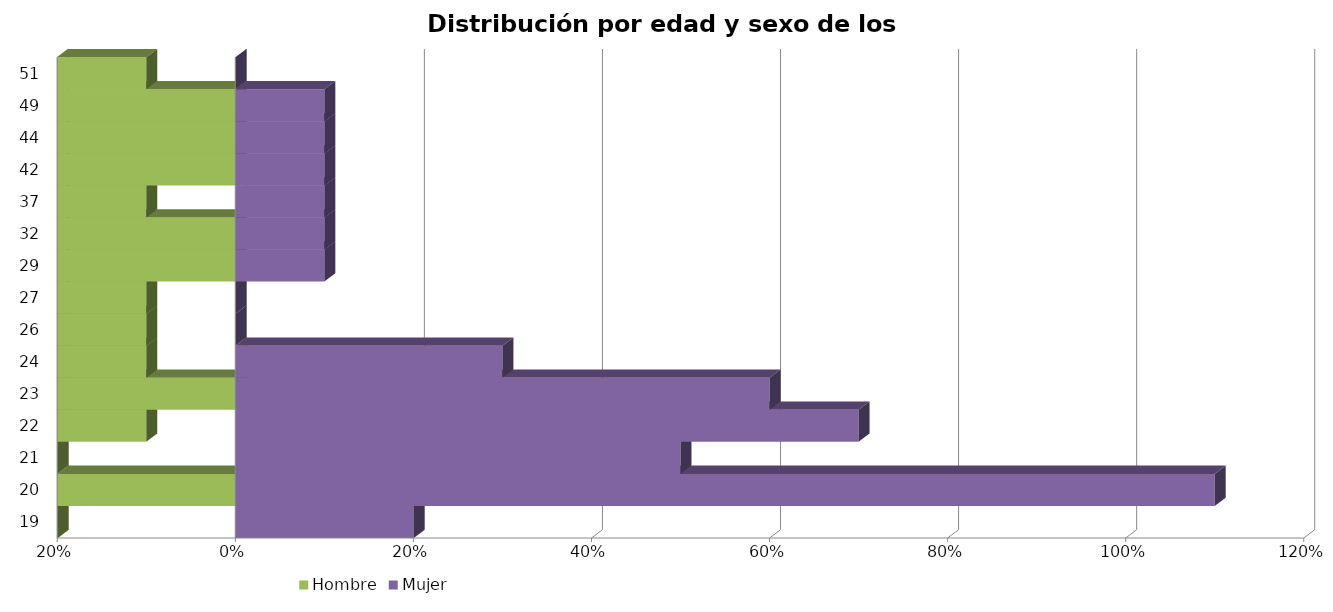
| Category | Hombre | Mujer |
|---|---|---|
| 19.0 | -0.2 | 0.2 |
| 20.0 | 0 | 1.1 |
| 21.0 | -0.2 | 0.5 |
| 22.0 | -0.1 | 0.7 |
| 23.0 | 0 | 0.6 |
| 24.0 | -0.1 | 0.3 |
| 26.0 | -0.1 | 0 |
| 27.0 | -0.1 | 0 |
| 29.0 | 0 | 0.1 |
| 32.0 | 0 | 0.1 |
| 37.0 | -0.1 | 0.1 |
| 42.0 | 0 | 0.1 |
| 44.0 | 0 | 0.1 |
| 49.0 | 0 | 0.1 |
| 51.0 | -0.1 | 0 |